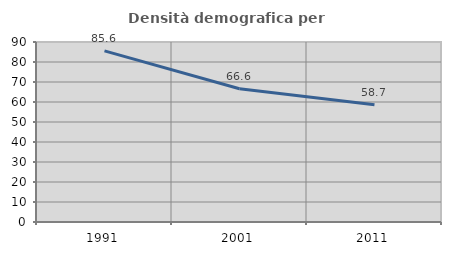
| Category | Densità demografica |
|---|---|
| 1991.0 | 85.585 |
| 2001.0 | 66.615 |
| 2011.0 | 58.674 |